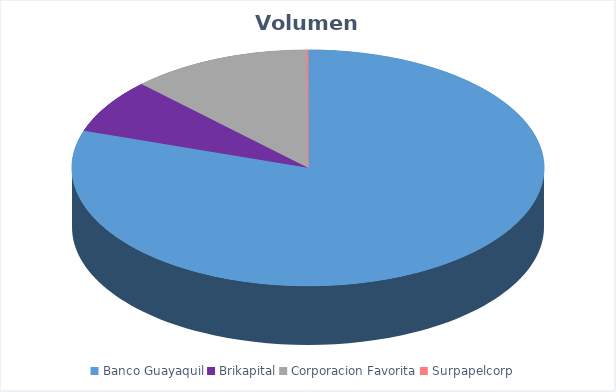
| Category | VOLUMEN ($USD) |
|---|---|
| Banco Guayaquil | 278461.4 |
| Brikapital | 26000 |
| Corporacion Favorita | 42887 |
| Surpapelcorp | 340 |